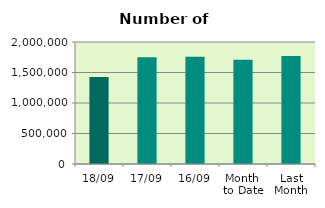
| Category | Series 0 |
|---|---|
| 18/09 | 1425096 |
| 17/09 | 1748228 |
| 16/09 | 1759146 |
| Month 
to Date | 1710924.462 |
| Last
Month | 1768562.909 |